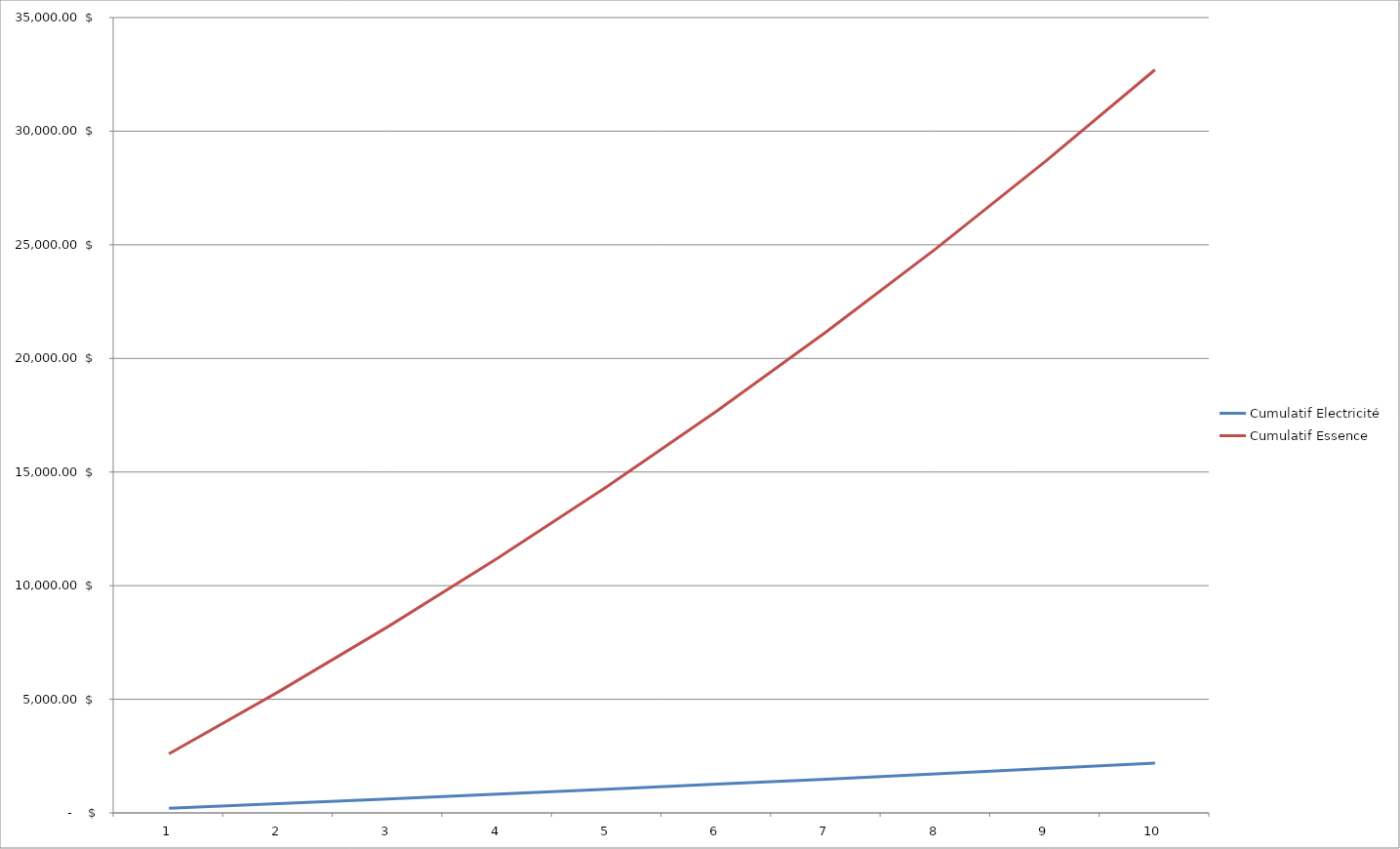
| Category | Cumulatif Electricité | Cumulatif Essence |
|---|---|---|
| 0 | 200 | 2600 |
| 1 | 404 | 5330 |
| 2 | 612.08 | 8196.5 |
| 3 | 824.322 | 11206.325 |
| 4 | 1040.808 | 14366.641 |
| 5 | 1261.624 | 17684.973 |
| 6 | 1486.857 | 21169.222 |
| 7 | 1716.594 | 24827.683 |
| 8 | 1950.926 | 28669.067 |
| 9 | 2189.944 | 32702.521 |